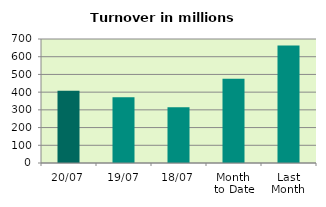
| Category | Series 0 |
|---|---|
| 20/07 | 407.301 |
| 19/07 | 371.524 |
| 18/07 | 314.879 |
| Month 
to Date | 475.572 |
| Last
Month | 663.186 |